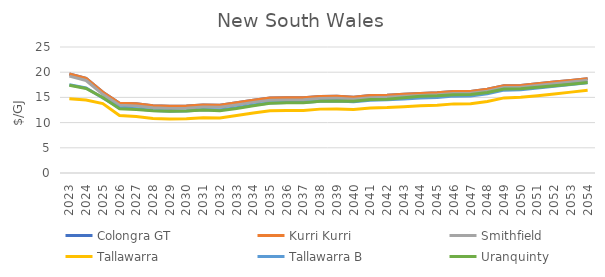
| Category | Colongra GT | Kurri Kurri | Smithfield | Tallawarra | Tallawarra B | Uranquinty |
|---|---|---|---|---|---|---|
| 2023.0 | 19.645 | 19.645 | 19.213 | 14.748 | 17.496 | 17.41 |
| 2024.0 | 18.786 | 18.786 | 18.357 | 14.483 | 16.867 | 16.767 |
| 2025.0 | 16.03 | 16.03 | 15.602 | 13.761 | 14.894 | 14.986 |
| 2026.0 | 13.849 | 13.849 | 13.424 | 11.424 | 12.924 | 12.757 |
| 2027.0 | 13.736 | 13.736 | 13.292 | 11.192 | 12.767 | 12.585 |
| 2028.0 | 13.367 | 13.367 | 12.924 | 10.824 | 12.399 | 12.343 |
| 2029.0 | 13.242 | 13.242 | 12.801 | 10.701 | 12.276 | 12.246 |
| 2030.0 | 13.285 | 13.285 | 12.846 | 10.746 | 12.321 | 12.299 |
| 2031.0 | 13.514 | 13.514 | 13.078 | 10.978 | 12.553 | 12.494 |
| 2032.0 | 13.461 | 13.461 | 13.027 | 10.927 | 12.502 | 12.36 |
| 2033.0 | 13.921 | 13.921 | 13.489 | 11.389 | 12.964 | 12.786 |
| 2034.0 | 14.445 | 14.445 | 14.015 | 11.915 | 13.49 | 13.342 |
| 2035.0 | 14.861 | 14.861 | 14.433 | 12.333 | 13.908 | 13.822 |
| 2036.0 | 14.927 | 14.927 | 14.502 | 12.402 | 13.977 | 13.916 |
| 2037.0 | 14.945 | 14.945 | 14.522 | 12.422 | 13.997 | 13.959 |
| 2038.0 | 15.195 | 15.195 | 14.774 | 12.674 | 14.249 | 14.256 |
| 2039.0 | 15.227 | 15.227 | 14.808 | 12.708 | 14.283 | 14.278 |
| 2040.0 | 15.034 | 15.034 | 14.626 | 12.576 | 14.114 | 14.217 |
| 2041.0 | 15.354 | 15.354 | 14.948 | 12.898 | 14.436 | 14.573 |
| 2042.0 | 15.428 | 15.428 | 15.025 | 12.975 | 14.512 | 14.651 |
| 2043.0 | 15.613 | 15.613 | 15.211 | 13.161 | 14.699 | 14.938 |
| 2044.0 | 15.784 | 15.784 | 15.384 | 13.334 | 14.872 | 15.217 |
| 2045.0 | 15.914 | 15.914 | 15.516 | 13.466 | 15.004 | 15.31 |
| 2046.0 | 16.161 | 16.161 | 15.765 | 13.715 | 15.253 | 15.509 |
| 2047.0 | 16.194 | 16.194 | 15.808 | 13.758 | 15.295 | 15.554 |
| 2048.0 | 16.6 | 16.6 | 16.223 | 14.173 | 15.711 | 15.984 |
| 2049.0 | 17.318 | 17.318 | 16.95 | 14.9 | 16.438 | 16.646 |
| 2050.0 | 17.384 | 17.384 | 17.029 | 15.012 | 16.527 | 16.7 |
| 2051.0 | 17.709 | 17.709 | 17.363 | 15.349 | 16.864 | 17.002 |
| 2052.0 | 18.041 | 18.041 | 17.703 | 15.694 | 17.209 | 17.31 |
| 2053.0 | 18.379 | 18.379 | 18.049 | 16.046 | 17.561 | 17.624 |
| 2054.0 | 18.723 | 18.723 | 18.403 | 16.407 | 17.922 | 17.943 |